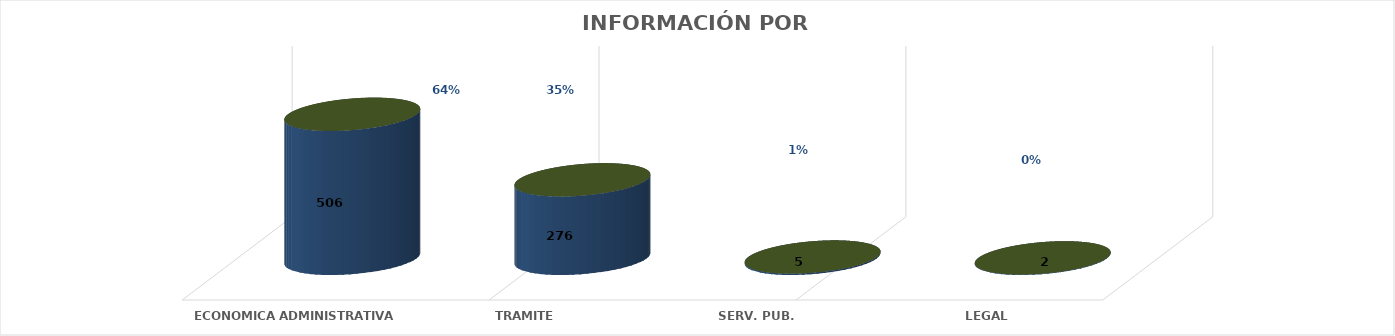
| Category | Series 0 | Series 1 | Series 2 | Series 3 | Series 4 |
|---|---|---|---|---|---|
| ECONOMICA ADMINISTRATIVA |  |  |  | 506 | 0.641 |
| TRAMITE |  |  |  | 276 | 0.35 |
| SERV. PUB. |  |  |  | 5 | 0.006 |
| LEGAL |  |  |  | 2 | 0.003 |